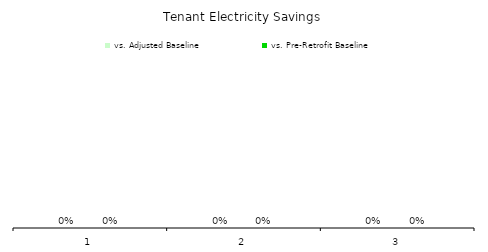
| Category | vs. Adjusted Baseline | vs. Pre-Retrofit Baseline |
|---|---|---|
| 0 | 0 | 0 |
| 1 | 0 | 0 |
| 2 | 0 | 0 |